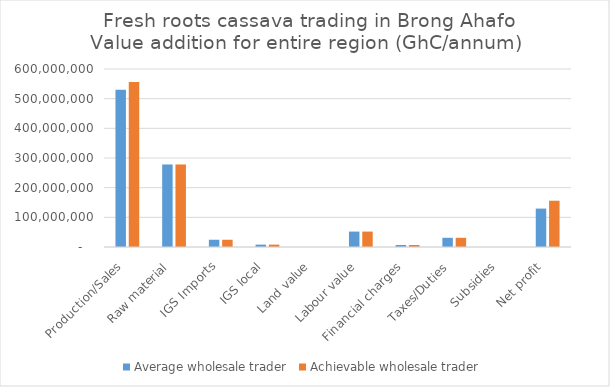
| Category | Average wholesale trader | Achievable wholesale trader |
|---|---|---|
| Production/Sales | 529920000 | 556416000 |
| Raw material | 278208000 | 278208000 |
| IGS Imports | 24426000 | 24426000 |
| IGS local | 8004000 | 8004000 |
| Land value | 0 | 0 |
| Labour value | 52003000 | 52003000 |
| Financial charges | 6762000 | 6762000 |
| Taxes/Duties | 31021480 | 31021480 |
| Subsidies | 0 | 0 |
| Net profit | 129495520 | 155991520 |